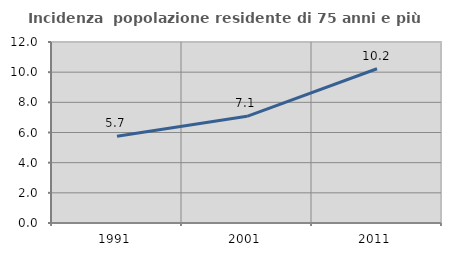
| Category | Incidenza  popolazione residente di 75 anni e più |
|---|---|
| 1991.0 | 5.748 |
| 2001.0 | 7.074 |
| 2011.0 | 10.226 |